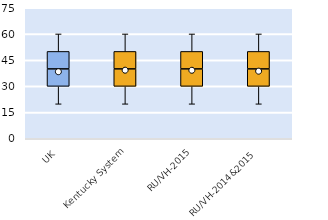
| Category | 25th | 50th | 75th |
|---|---|---|---|
| UK | 30 | 10 | 10 |
| Kentucky System | 30 | 10 | 10 |
| RU/VH-2015 | 30 | 10 | 10 |
| RU/VH-2014&2015 | 30 | 10 | 10 |